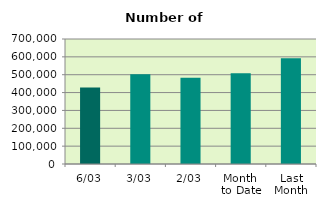
| Category | Series 0 |
|---|---|
| 6/03 | 428484 |
| 3/03 | 502776 |
| 2/03 | 483200 |
| Month 
to Date | 507703.5 |
| Last
Month | 592303 |